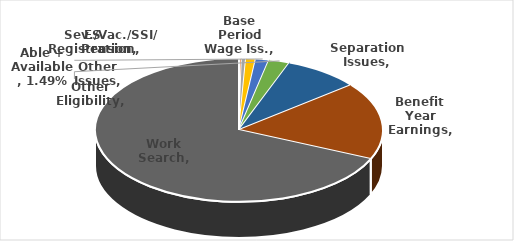
| Category | Series 0 |
|---|---|
| Base Period Wage Iss. | 0.001 |
| ES Registration | 0.002 |
| Other Issues | 0.005 |
| Sev./Vac./SSI/ Pension | 0.011 |
| Able + Available | 0.015 |
| Other Eligibility | 0.024 |
| Separation Issues | 0.085 |
| Benefit Year Earnings | 0.174 |
| Work Search | 0.684 |